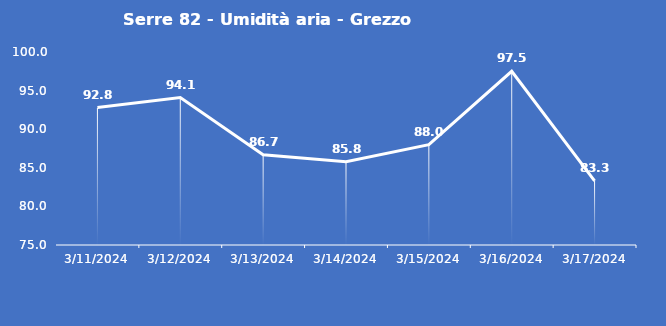
| Category | Serre 82 - Umidità aria - Grezzo (%) |
|---|---|
| 3/11/24 | 92.8 |
| 3/12/24 | 94.1 |
| 3/13/24 | 86.7 |
| 3/14/24 | 85.8 |
| 3/15/24 | 88 |
| 3/16/24 | 97.5 |
| 3/17/24 | 83.3 |